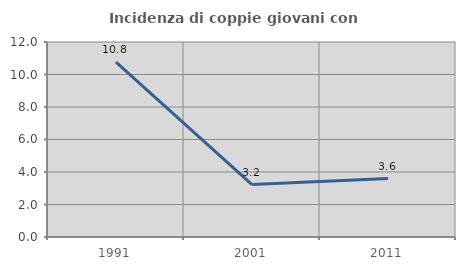
| Category | Incidenza di coppie giovani con figli |
|---|---|
| 1991.0 | 10.759 |
| 2001.0 | 3.226 |
| 2011.0 | 3.597 |